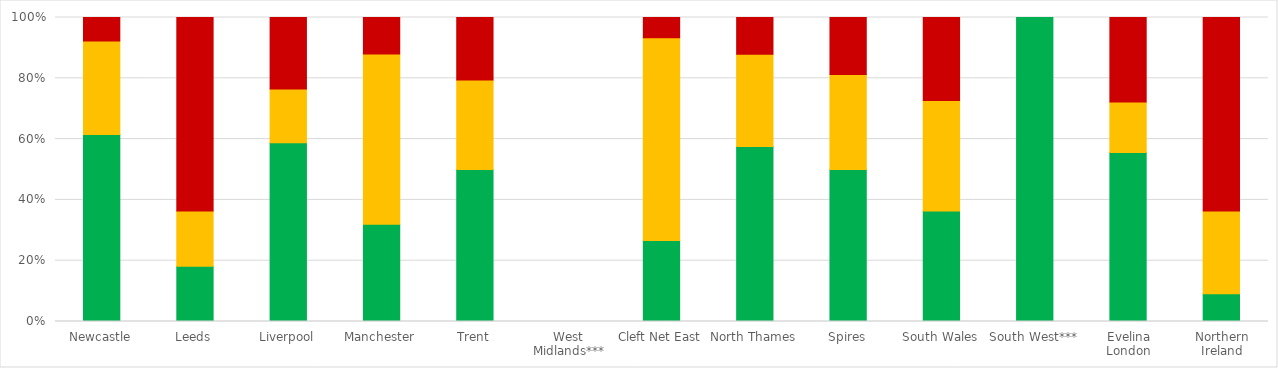
| Category | Good facial growth score        (1 or 2) | Fair facial growth score       (3) | Poor facial growth score       (4 or 5) |
|---|---|---|---|
| Newcastle | 0.615 | 0.308 | 0.077 |
| Leeds | 0.182 | 0.182 | 0.636 |
| Liverpool | 0.588 | 0.176 | 0.235 |
| Manchester | 0.32 | 0.56 | 0.12 |
| Trent | 0.5 | 0.294 | 0.206 |
| West Midlands*** | 0 | 0 | 0 |
| Cleft Net East | 0.267 | 0.667 | 0.067 |
| North Thames | 0.576 | 0.303 | 0.121 |
| Spires | 0.5 | 0.312 | 0.188 |
| South Wales | 0.364 | 0.364 | 0.273 |
| South West*** | 1 | 0 | 0 |
| Evelina London | 0.556 | 0.167 | 0.278 |
| Northern Ireland | 0.091 | 0.273 | 0.636 |